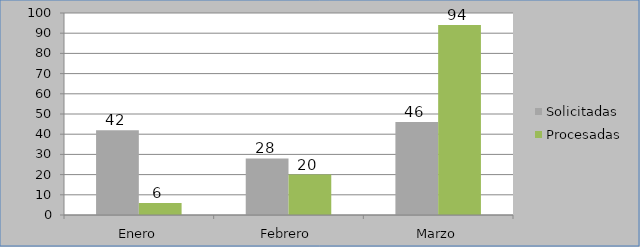
| Category | Solicitadas | Procesadas |
|---|---|---|
| Enero | 42 | 6 |
| Febrero | 28 | 20 |
| Marzo | 46 | 94 |